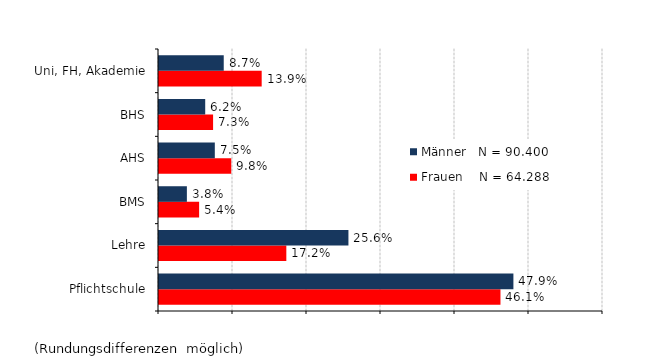
| Category | Frauen    N = 64.288 | Männer   N = 90.400 |
|---|---|---|
| Pflichtschule | 0.461 | 0.479 |
| Lehre | 0.172 | 0.256 |
| BMS | 0.054 | 0.038 |
| AHS | 0.098 | 0.075 |
| BHS | 0.073 | 0.062 |
| Uni, FH, Akademie | 0.139 | 0.087 |